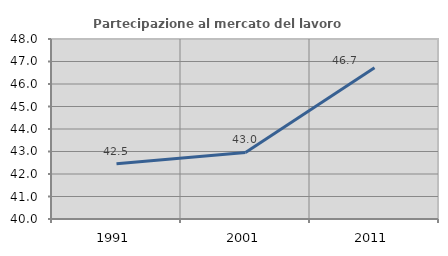
| Category | Partecipazione al mercato del lavoro  femminile |
|---|---|
| 1991.0 | 42.454 |
| 2001.0 | 42.958 |
| 2011.0 | 46.718 |